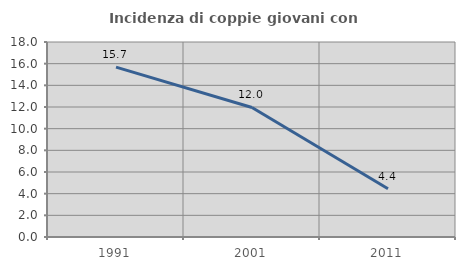
| Category | Incidenza di coppie giovani con figli |
|---|---|
| 1991.0 | 15.676 |
| 2001.0 | 11.954 |
| 2011.0 | 4.449 |